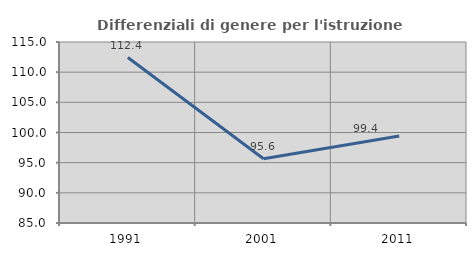
| Category | Differenziali di genere per l'istruzione superiore |
|---|---|
| 1991.0 | 112.42 |
| 2001.0 | 95.64 |
| 2011.0 | 99.429 |